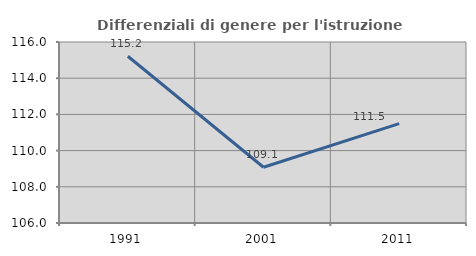
| Category | Differenziali di genere per l'istruzione superiore |
|---|---|
| 1991.0 | 115.213 |
| 2001.0 | 109.08 |
| 2011.0 | 111.488 |